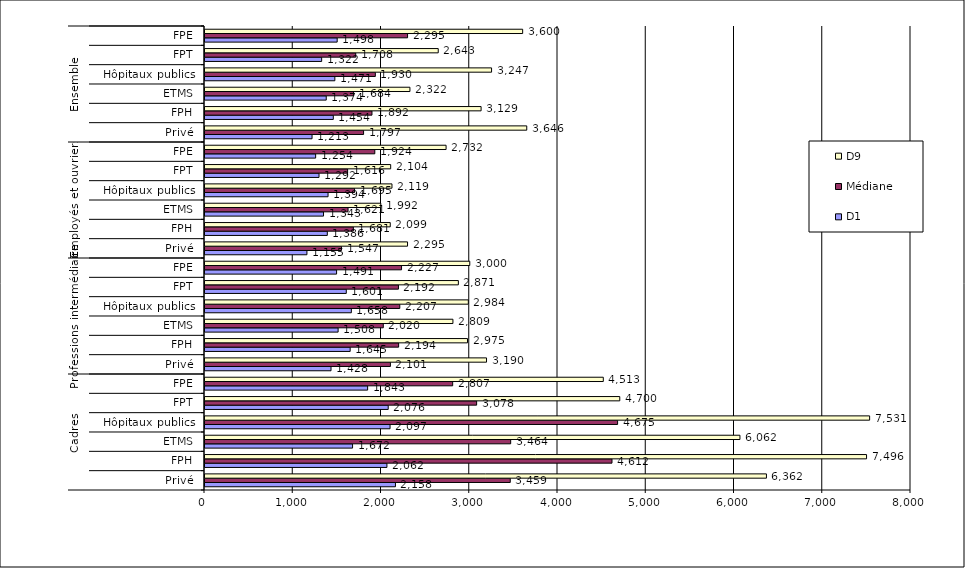
| Category | D1 | Médiane | D9 |
|---|---|---|---|
| 0 | 2158 | 3459 | 6362 |
| 1 | 2061.5 | 4611.83 | 7496.3 |
| 2 | 1672.25 | 3463.75 | 6061.77 |
| 3 | 2097 | 4675.42 | 7531.28 |
| 4 | 2076 | 3078 | 4700 |
| 5 | 1842.903 | 2806.5 | 4513.417 |
| 6 | 1428 | 2101 | 3190 |
| 7 | 1644.83 | 2194.08 | 2974.58 |
| 8 | 1508.42 | 2020.33 | 2809.33 |
| 9 | 1658.33 | 2207.25 | 2983.92 |
| 10 | 1601 | 2192 | 2871 |
| 11 | 1491 | 2227.333 | 3000.449 |
| 12 | 1155 | 1547 | 2295 |
| 13 | 1385.83 | 1681.25 | 2099.27 |
| 14 | 1343 | 1621.01 | 1992.12 |
| 15 | 1394.41 | 1694.83 | 2118.75 |
| 16 | 1292 | 1616 | 2104 |
| 17 | 1253.778 | 1924.167 | 2731.917 |
| 18 | 1213 | 1797 | 3646 |
| 19 | 1453.82 | 1892 | 3128.58 |
| 20 | 1373.88 | 1684.08 | 2322.17 |
| 21 | 1471.33 | 1930.19 | 3247.17 |
| 22 | 1322 | 1708 | 2643 |
| 23 | 1497.734 | 2295.332 | 3599.583 |